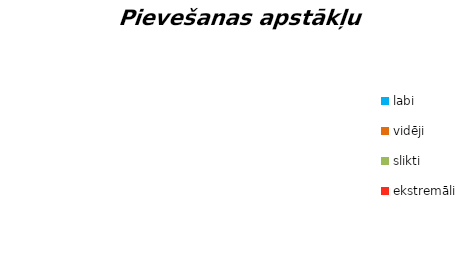
| Category | Series 0 |
|---|---|
| labi | 0 |
| vidēji | 0 |
| slikti | 0 |
| ekstremāli | 0 |